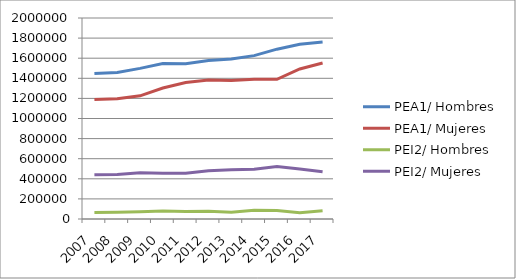
| Category | PEA1/ Hombres | PEA1/ Mujeres | PEI2/ Hombres | PEI2/ Mujeres |
|---|---|---|---|---|
| 2007.0 | 1448792 | 1188600 | 64183 | 439440 |
| 2008.0 | 1458402 | 1195708 | 67172 | 443985 |
| 2009.0 | 1498670 | 1225904 | 72962 | 460456 |
| 2010.0 | 1546847 | 1302928 | 78412 | 456038 |
| 2011.0 | 1545557 | 1358554 | 74894 | 455498 |
| 2012.0 | 1576813 | 1383396 | 76098 | 480068 |
| 2013.0 | 1591300 | 1378657 | 68251 | 489434 |
| 2014.0 | 1625615 | 1390249 | 86893 | 494408 |
| 2015.0 | 1689929 | 1389804 | 84194 | 521441 |
| 2016.0 | 1739366 | 1492950 | 62909 | 497216 |
| 2017.0 | 1760412 | 1552824 | 81253 | 470507 |